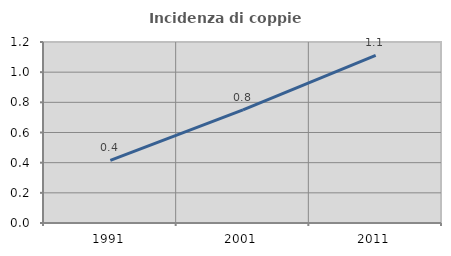
| Category | Incidenza di coppie miste |
|---|---|
| 1991.0 | 0.416 |
| 2001.0 | 0.751 |
| 2011.0 | 1.111 |